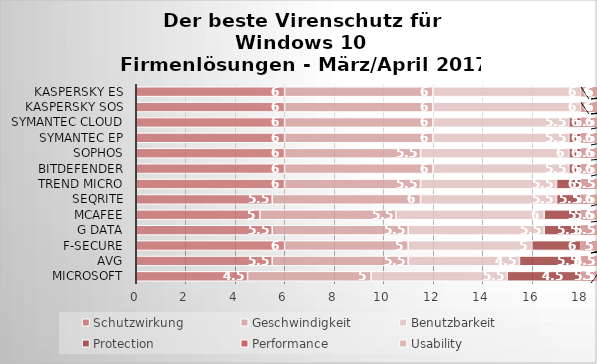
| Category | Schutzwirkung | Geschwindigkeit | Benutzbarkeit | Protection | Performance | Usability |
|---|---|---|---|---|---|---|
| Microsoft | 4.5 | 5 | 5.5 | 4.5 | 5 | 5.5 |
| AVG | 5.5 | 5.5 | 4.5 | 5.5 | 5.5 | 4.5 |
| F-Secure | 6 | 5 | 5 | 6 | 5 | 5 |
| G Data | 5.5 | 5.5 | 5.5 | 5.5 | 5.5 | 5.5 |
| McAfee | 5 | 5.5 | 6 | 5 | 5.5 | 6 |
| Seqrite | 5.5 | 6 | 5.5 | 5.5 | 6 | 5.5 |
| Trend Micro | 6 | 5.5 | 5.5 | 6 | 5.5 | 5.5 |
| Bitdefender | 6 | 6 | 5.5 | 6 | 6 | 5.5 |
| Sophos | 6 | 5.5 | 6 | 6 | 5.5 | 6 |
| Symantec EP | 6 | 6 | 5.5 | 6 | 6 | 5.5 |
| Symantec Cloud | 6 | 6 | 5.5 | 6 | 6 | 5.5 |
| Kaspersky SOS | 6 | 6 | 6 | 6 | 6 | 6 |
| Kaspersky ES | 6 | 6 | 6 | 6 | 6 | 6 |